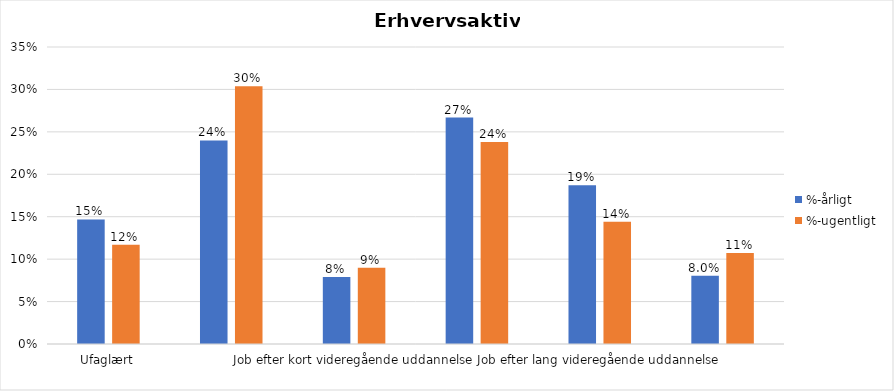
| Category | %-årligt | %-ugentligt |
|---|---|---|
| Ufaglært | 0.147 | 0.117 |
| Erhvervsfagligt job | 0.24 | 0.304 |
| Job efter kort videregående uddannelse | 0.079 | 0.09 |
| Job efter mellemlang videregående uddannelse | 0.267 | 0.238 |
| Job efter lang videregående uddannelse | 0.187 | 0.144 |
| Selvstændig | 0.08 | 0.107 |